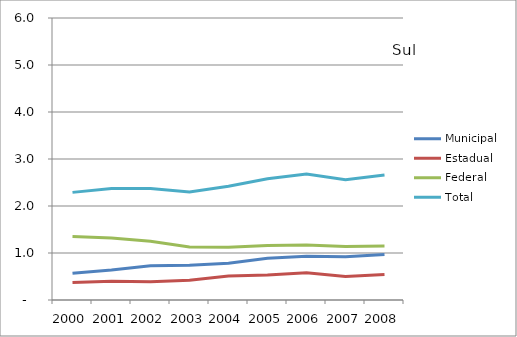
| Category | Municipal | Estadual | Federal | Total |
|---|---|---|---|---|
| 2000.0 | 0.57 | 0.37 | 1.35 | 2.29 |
| 2001.0 | 0.64 | 0.4 | 1.32 | 2.37 |
| 2002.0 | 0.73 | 0.39 | 1.25 | 2.37 |
| 2003.0 | 0.74 | 0.42 | 1.13 | 2.3 |
| 2004.0 | 0.78 | 0.51 | 1.12 | 2.42 |
| 2005.0 | 0.89 | 0.53 | 1.16 | 2.58 |
| 2006.0 | 0.93 | 0.58 | 1.17 | 2.68 |
| 2007.0 | 0.92 | 0.5 | 1.14 | 2.56 |
| 2008.0 | 0.97 | 0.54 | 1.15 | 2.66 |